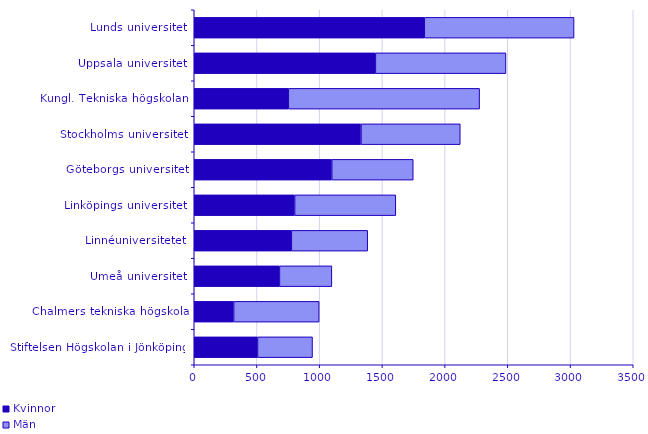
| Category | Kvinnor | Män |
|---|---|---|
| Stiftelsen Högskolan i Jönköping | 504 | 439 |
| Chalmers tekniska högskola | 314 | 682 |
| Umeå universitet | 679 | 418 |
| Linnéuniversitetet | 774 | 609 |
| Linköpings universitet | 800 | 807 |
| Göteborgs universitet | 1096 | 650 |
| Stockholms universitet | 1329 | 792 |
| Kungl. Tekniska högskolan | 750 | 1525 |
| Uppsala universitet | 1444 | 1041 |
| Lunds universitet | 1834 | 1194 |